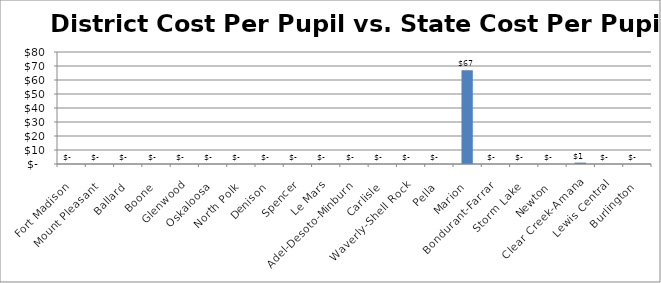
| Category | DCPP Vs. SCPP |
|---|---|
| Fort Madison | 0 |
| Mount Pleasant | 0 |
| Ballard | 0 |
| Boone | 0 |
| Glenwood | 0 |
| Oskaloosa | 0 |
| North Polk | 0 |
| Denison | 0 |
| Spencer | 0 |
| Le Mars | 0 |
| Adel-Desoto-Minburn | 0 |
| Carlisle | 0 |
| Waverly-Shell Rock | 0 |
| Pella | 0 |
| Marion | 67 |
| Bondurant-Farrar | 0 |
| Storm Lake | 0 |
| Newton | 0 |
| Clear Creek-Amana | 1 |
| Lewis Central | 0 |
| Burlington | 0 |